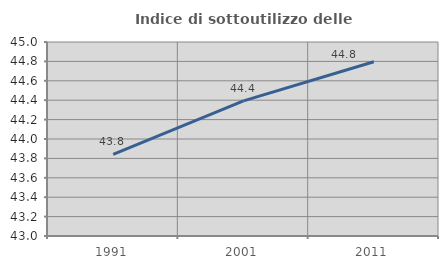
| Category | Indice di sottoutilizzo delle abitazioni  |
|---|---|
| 1991.0 | 43.842 |
| 2001.0 | 44.393 |
| 2011.0 | 44.796 |